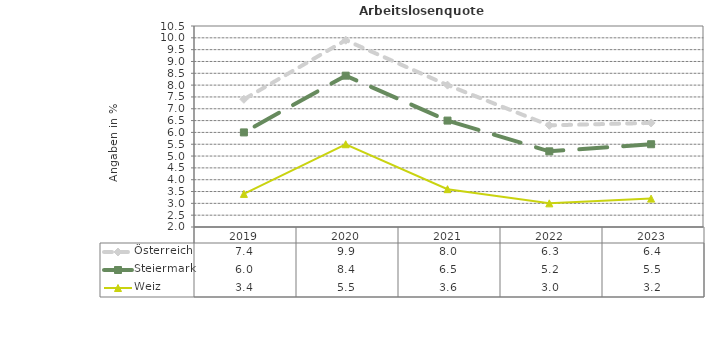
| Category | Österreich | Steiermark | Weiz |
|---|---|---|---|
| 2023.0 | 6.4 | 5.5 | 3.2 |
| 2022.0 | 6.3 | 5.2 | 3 |
| 2021.0 | 8 | 6.5 | 3.6 |
| 2020.0 | 9.9 | 8.4 | 5.5 |
| 2019.0 | 7.4 | 6 | 3.4 |